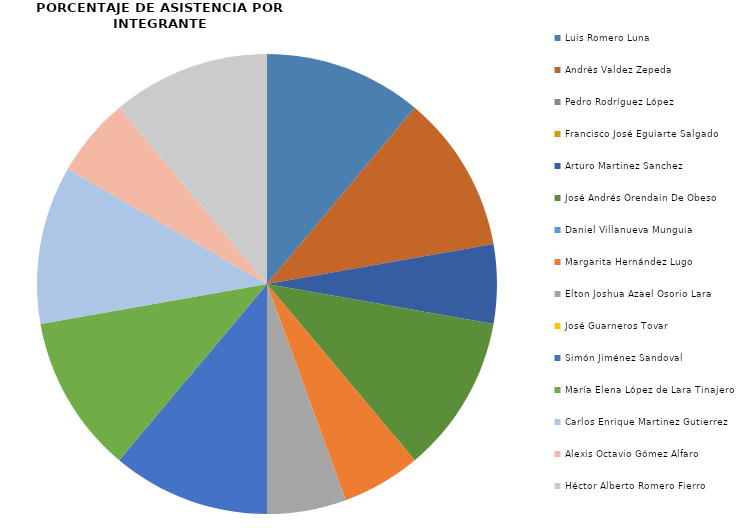
| Category | Series 0 |
|---|---|
| Luis Romero Luna | 2 |
| Andrés Valdez Zepeda | 2 |
| Pedro Rodríguez López | 0 |
| Francisco José Eguiarte Salgado | 0 |
| Arturo Martinez Sanchez  | 1 |
| José Andrés Orendain De Obeso | 2 |
| Daniel Villanueva Munguia | 0 |
| Margarita Hernández Lugo | 1 |
| Elton Joshua Azael Osorio Lara | 1 |
| José Guarneros Tovar | 0 |
| Simón Jiménez Sandoval | 2 |
| María Elena López de Lara Tinajero | 2 |
| Carlos Enrique Martinez Gutierrez | 2 |
| Alexis Octavio Gómez Alfaro | 1 |
| Héctor Alberto Romero Fierro | 2 |